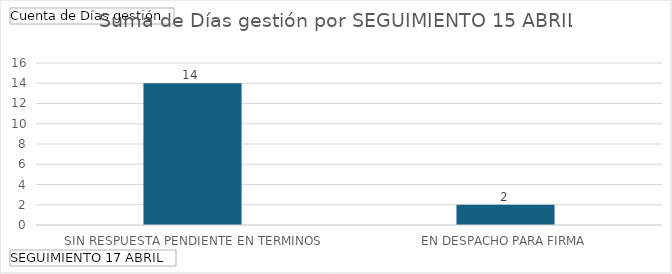
| Category | Total |
|---|---|
| SIN RESPUESTA PENDIENTE EN TERMINOS | 14 |
| EN DESPACHO PARA FIRMA | 2 |